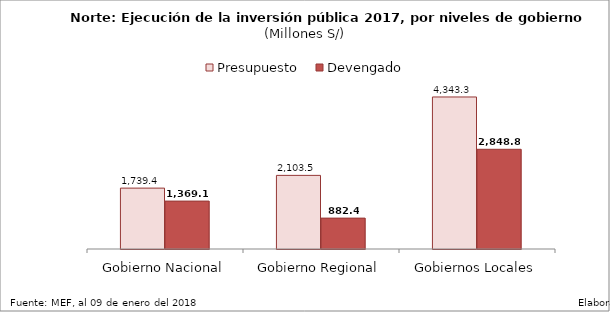
| Category | Presupuesto | Devengado |
|---|---|---|
| Gobierno Nacional | 1739.417 | 1369.126 |
| Gobierno Regional | 2103.488 | 882.355 |
| Gobiernos Locales | 4343.319 | 2848.768 |